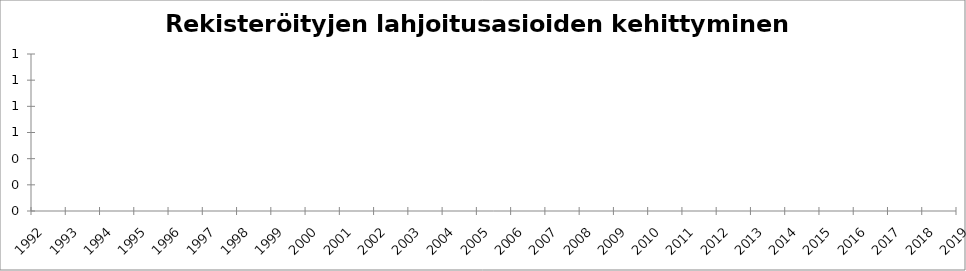
| Category | Series 0 |
|---|---|
| 1992 | 157 |
| 1993 | 218 |
| 1994 | 119 |
| 1995 | 246 |
| 1996 | 156 |
| 1997 | 130 |
| 1998 | 110 |
| 1999 | 102 |
| 2000 | 88 |
| 2001 | 76 |
| 2002 | 98 |
| 2003 | 53 |
| 2004 | 48 |
| 2005 | 78 |
| 2006 | 115 |
| 2007 | 70 |
| 2008 | 70 |
| 2009 | 114 |
| 2010 | 97 |
| 2011 | 101 |
| 2012 | 130 |
| 2013 | 153 |
| 2014 | 126 |
| 2015 | 155 |
| 2016 | 116 |
| 2017 | 163 |
| 2018 | 124 |
| 2019 | 146 |